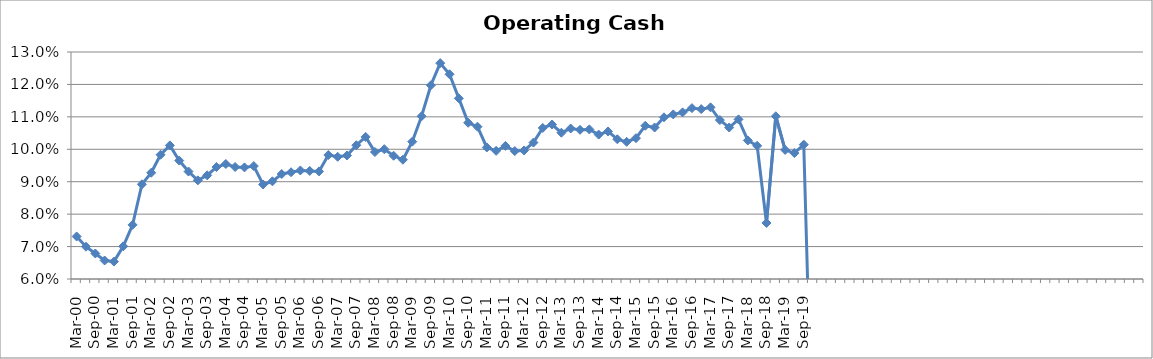
| Category | Operating Cash Margin |
|---|---|
| Mar-00 | 0.073 |
| Jun-00 | 0.07 |
| Sep-00 | 0.068 |
| Dec-00 | 0.066 |
| Mar-01 | 0.065 |
| Jun-01 | 0.07 |
| Sep-01 | 0.077 |
| Dec-01 | 0.089 |
| Mar-02 | 0.093 |
| Jun-02 | 0.098 |
| Sep-02 | 0.101 |
| Dec-02 | 0.097 |
| Mar-03 | 0.093 |
| Jun-03 | 0.09 |
| Sep-03 | 0.092 |
| Dec-03 | 0.095 |
| Mar-04 | 0.095 |
| Jun-04 | 0.095 |
| Sep-04 | 0.094 |
| Dec-04 | 0.095 |
| Mar-05 | 0.089 |
| Jun-05 | 0.09 |
| Sep-05 | 0.092 |
| Dec-05 | 0.093 |
| Mar-06 | 0.093 |
| Jun-06 | 0.093 |
| Sep-06 | 0.093 |
| Dec-06 | 0.098 |
| Mar-07 | 0.098 |
| Jun-07 | 0.098 |
| Sep-07 | 0.101 |
| Dec-07 | 0.104 |
| Mar-08 | 0.099 |
| Jun-08 | 0.1 |
| Sep-08 | 0.098 |
| Dec-08 | 0.097 |
| Mar-09 | 0.102 |
| Jun-09 | 0.11 |
| Sep-09 | 0.12 |
| Dec-09 | 0.127 |
| Mar-10 | 0.123 |
| Jun-10 | 0.116 |
| Sep-10 | 0.108 |
| Dec-10 | 0.107 |
| Mar-11 | 0.101 |
| Jun-11 | 0.1 |
| Sep-11 | 0.101 |
| Dec-11 | 0.099 |
| Mar-12 | 0.1 |
| Jun-12 | 0.102 |
| Sep-12 | 0.107 |
| Dec-12 | 0.108 |
| Mar-13 | 0.105 |
| Jun-13 | 0.106 |
| Sep-13 | 0.106 |
| Dec-13 | 0.106 |
| Mar-14 | 0.105 |
| Jun-14 | 0.106 |
| Sep-14 | 0.103 |
| Dec-14 | 0.102 |
| Mar-15 | 0.103 |
| Jun-15 | 0.107 |
| Sep-15 | 0.107 |
| Dec-15 | 0.11 |
| Mar-16 | 0.111 |
| Jun-16 | 0.111 |
| Sep-16 | 0.113 |
| Dec-16 | 0.112 |
| Mar-17 | 0.113 |
| Jun-17 | 0.109 |
| Sep-17 | 0.107 |
| Dec-17 | 0.109 |
| Mar-18 | 0.103 |
| Jun-18 | 0.101 |
| Sep-18 | 0.077 |
| Dec-18 | 0.11 |
| Mar-19 | 0.1 |
| Jun-19 | 0.099 |
| Sep-19 | 0.101 |